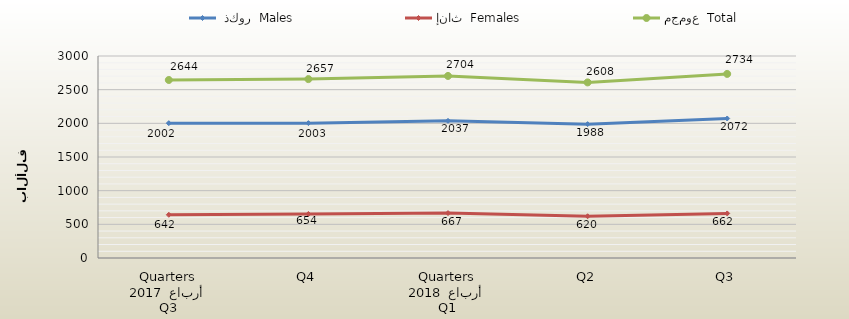
| Category |  ذكور  Males | إناث  Females | مجموع  Total |
|---|---|---|---|
| 0 | 2002 | 642 | 2644 |
| 1 | 2003 | 654 | 2657 |
| 2 | 2037 | 667 | 2704 |
| 3 | 1988 | 620 | 2608 |
| 4 | 2072 | 662 | 2734 |